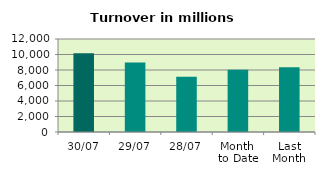
| Category | Series 0 |
|---|---|
| 30/07 | 10164.97 |
| 29/07 | 8976.889 |
| 28/07 | 7122.923 |
| Month 
to Date | 8019.786 |
| Last
Month | 8344.334 |